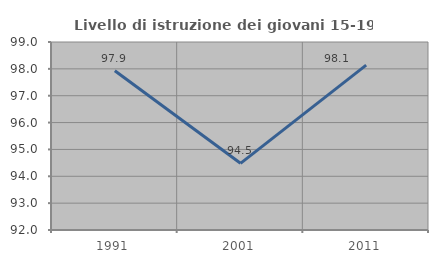
| Category | Livello di istruzione dei giovani 15-19 anni |
|---|---|
| 1991.0 | 97.931 |
| 2001.0 | 94.483 |
| 2011.0 | 98.137 |